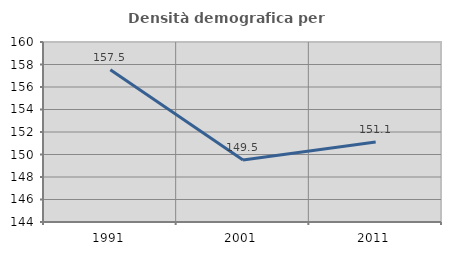
| Category | Densità demografica |
|---|---|
| 1991.0 | 157.531 |
| 2001.0 | 149.506 |
| 2011.0 | 151.12 |